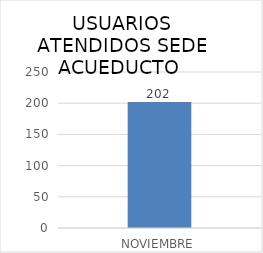
| Category | Series 0 |
|---|---|
| NOVIEMBRE | 202 |